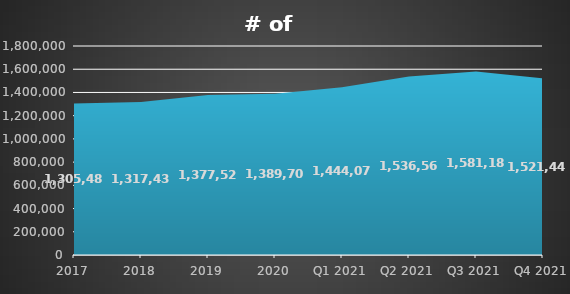
| Category | # of producers* |
|---|---|
| 2017 | 1305483 |
| 2018 | 1317435 |
| 2019 | 1377528 |
| 2020 | 1389702 |
| Q1 2021 | 1444073 |
| Q2 2021 | 1536565 |
| Q3 2021 | 1581184 |
| Q4 2021 | 1521444 |